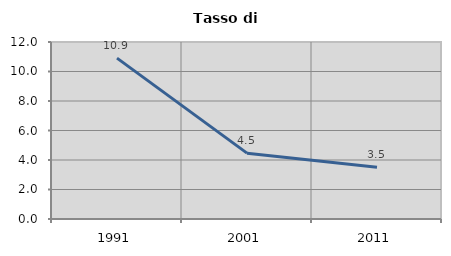
| Category | Tasso di disoccupazione   |
|---|---|
| 1991.0 | 10.909 |
| 2001.0 | 4.464 |
| 2011.0 | 3.509 |